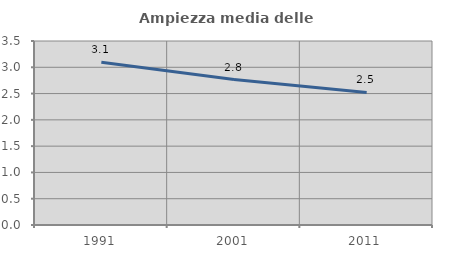
| Category | Ampiezza media delle famiglie |
|---|---|
| 1991.0 | 3.097 |
| 2001.0 | 2.766 |
| 2011.0 | 2.521 |